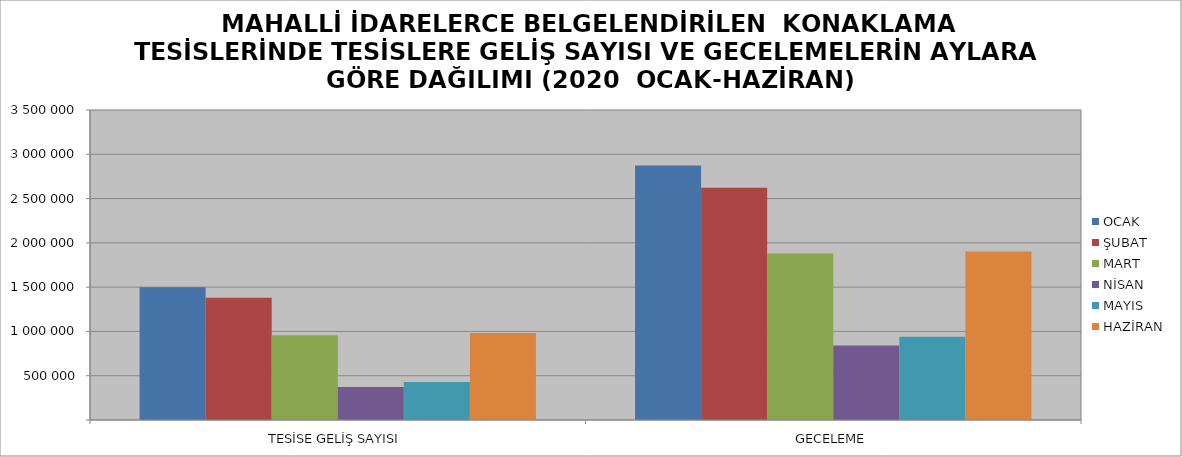
| Category | OCAK | ŞUBAT | MART | NİSAN | MAYIS | HAZİRAN |
|---|---|---|---|---|---|---|
| TESİSE GELİŞ SAYISI | 1497815 | 1380765 | 955554 | 372466 | 430328 | 981538 |
| GECELEME | 2872303 | 2621819 | 1878971 | 839735 | 939652 | 1902057 |